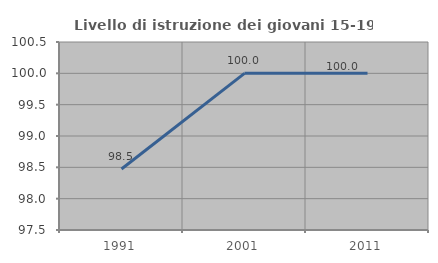
| Category | Livello di istruzione dei giovani 15-19 anni |
|---|---|
| 1991.0 | 98.473 |
| 2001.0 | 100 |
| 2011.0 | 100 |